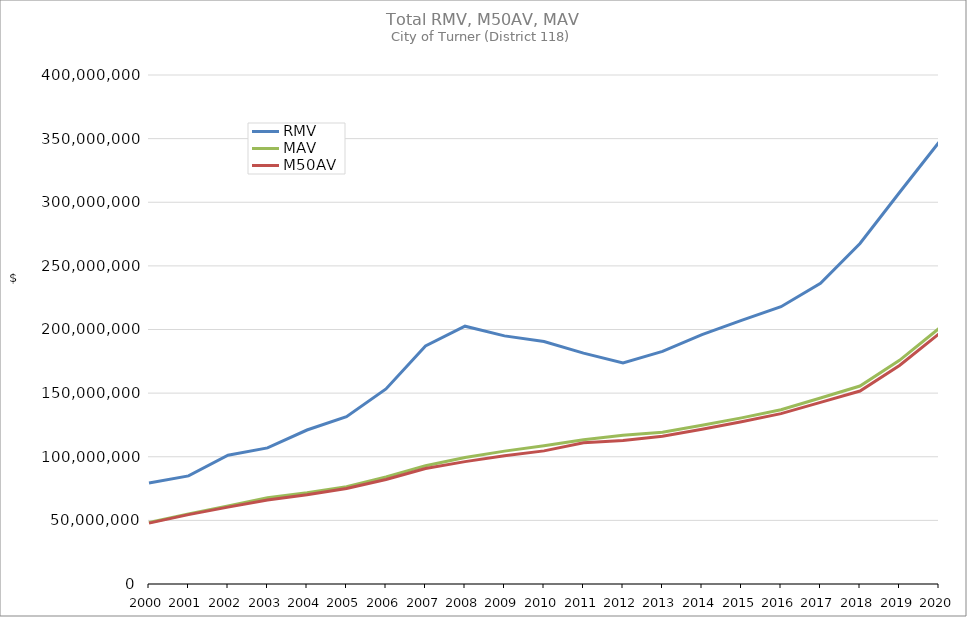
| Category | RMV | MAV | M50AV |
|---|---|---|---|
| 2000.0 | 79435771 | 48340973 | 47853306 |
| 2001.0 | 84936715 | 55122662 | 54504733 |
| 2002.0 | 101229667 | 61305822 | 60395206 |
| 2003.0 | 106962893 | 67725398 | 66076057 |
| 2004.0 | 121006811 | 71692082 | 70099686 |
| 2005.0 | 131491167 | 76406668 | 75091840 |
| 2006.0 | 153263786 | 84128699 | 82152594 |
| 2007.0 | 187134883 | 92895281 | 90777901 |
| 2008.0 | 202589086 | 99407540 | 96161270 |
| 2009.0 | 194996696 | 104415430 | 100759155 |
| 2010.0 | 190616519 | 108608076 | 104603358 |
| 2011.0 | 181447670 | 113358766 | 110984459 |
| 2012.0 | 173641001 | 116942425 | 112743723 |
| 2013.0 | 182851302 | 119241830 | 116148791 |
| 2014.0 | 195973491 | 124717085 | 121676446 |
| 2015.0 | 207120738 | 130554286 | 127507653 |
| 2016.0 | 217900288 | 136928247 | 133876644 |
| 2017.0 | 236230782 | 146153743 | 142712445 |
| 2018.0 | 267626800 | 155577458 | 151665664 |
| 2019.0 | 307633459 | 175754915 | 171701088 |
| 2020.0 | 347185345 | 200848972 | 196609369 |